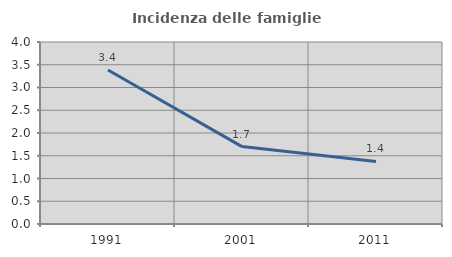
| Category | Incidenza delle famiglie numerose |
|---|---|
| 1991.0 | 3.385 |
| 2001.0 | 1.701 |
| 2011.0 | 1.376 |